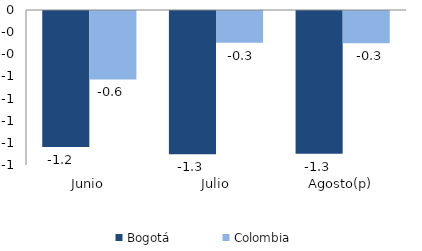
| Category | Bogotá | Colombia |
|---|---|---|
| Junio | -1.229 | -0.618 |
| Julio | -1.293 | -0.286 |
| Agosto(p) | -1.29 | -0.291 |